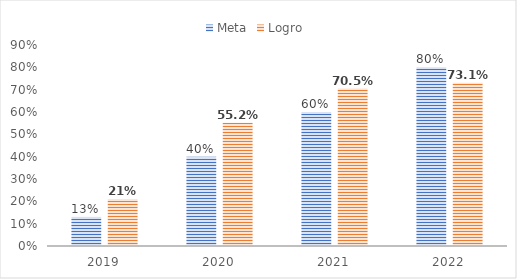
| Category | Meta | Logro  |
|---|---|---|
| 2019.0 | 0.13 | 0.21 |
| 2020.0 | 0.4 | 0.552 |
| 2021.0 | 0.6 | 0.705 |
| 2022.0 | 0.8 | 0.731 |